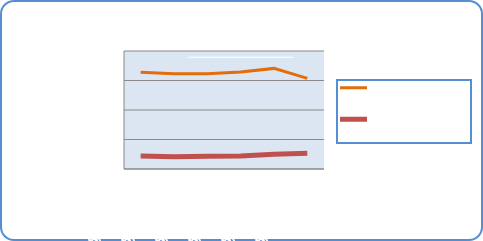
| Category | Motorin Türleri  | Benzin Türleri |
|---|---|---|
| 6/25/18 | 65653703.361 | 8881096.024 |
| 6/26/18 | 64649846.835 | 8355537.866 |
| 6/27/18 | 64524657.975 | 8618632.164 |
| 6/28/18 | 65738582.868 | 8839606.236 |
| 6/29/18 | 68212886.037 | 10011806.904 |
| 6/30/18 | 61427329.491 | 10670965.827 |